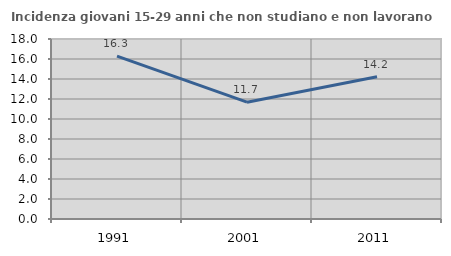
| Category | Incidenza giovani 15-29 anni che non studiano e non lavorano  |
|---|---|
| 1991.0 | 16.295 |
| 2001.0 | 11.683 |
| 2011.0 | 14.224 |